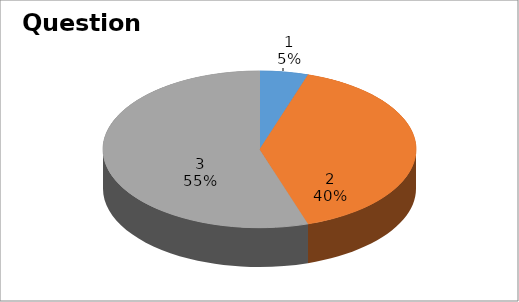
| Category | Series 0 |
|---|---|
| 0 | 1 |
| 1 | 8 |
| 2 | 11 |